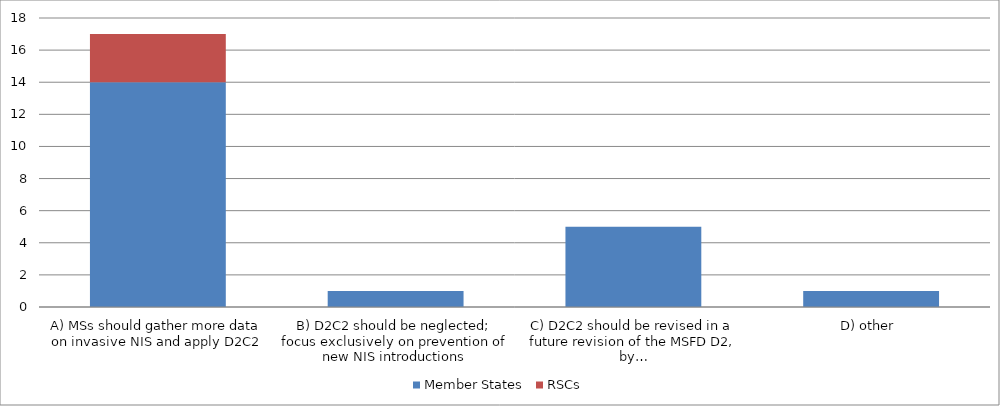
| Category | Member States | RSCs |
|---|---|---|
| A) MSs should gather more data on invasive NIS and apply D2C2 | 14 | 3 |
| B) D2C2 should be neglected; focus exclusively on prevention of new NIS introductions | 1 | 0 |
| C) D2C2 should be revised in a future revision of the MSFD D2, by… | 5 | 0 |
| D) other  | 1 | 0 |